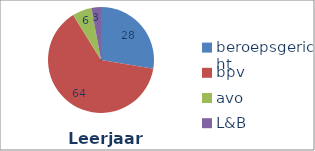
| Category | Series 0 |
|---|---|
| beroepsgericht | 27.611 |
| bpv | 63.579 |
| avo | 5.904 |
| L&B | 2.906 |